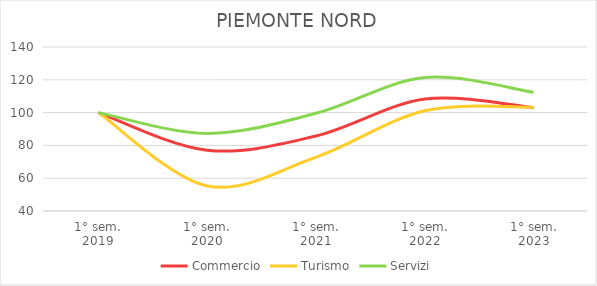
| Category | Commercio | Turismo | Servizi |
|---|---|---|---|
| 1° sem.
2019 | 100 | 100 | 100 |
| 1° sem.
2020 | 77.044 | 55.267 | 87.295 |
| 1° sem.
2021 | 85.771 | 72.864 | 99.597 |
| 1° sem.
2022 | 108.296 | 101.128 | 121.388 |
| 1° sem.
2023 | 103.036 | 103.301 | 112.37 |